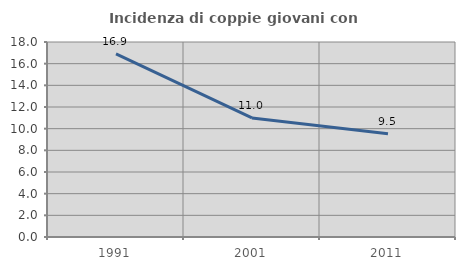
| Category | Incidenza di coppie giovani con figli |
|---|---|
| 1991.0 | 16.897 |
| 2001.0 | 10.989 |
| 2011.0 | 9.524 |